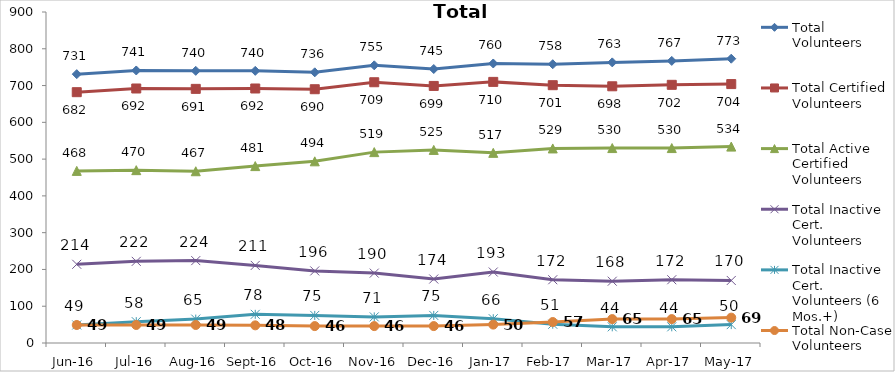
| Category | Total Volunteers | Total Certified Volunteers | Total Active Certified Volunteers | Total Inactive Cert. Volunteers | Total Inactive Cert. Volunteers (6 Mos.+) | Total Non-Case Volunteers |
|---|---|---|---|---|---|---|
| Jun-16 | 731 | 682 | 468 | 214 | 49 | 49 |
| Jul-16 | 741 | 692 | 470 | 222 | 58 | 49 |
| Aug-16 | 740 | 691 | 467 | 224 | 65 | 49 |
| Sep-16 | 740 | 692 | 481 | 211 | 78 | 48 |
| Oct-16 | 736 | 690 | 494 | 196 | 75 | 46 |
| Nov-16 | 755 | 709 | 519 | 190 | 71 | 46 |
| Dec-16 | 745 | 699 | 525 | 174 | 75 | 46 |
| Jan-17 | 760 | 710 | 517 | 193 | 66 | 50 |
| Feb-17 | 758 | 701 | 529 | 172 | 51 | 57 |
| Mar-17 | 763 | 698 | 530 | 168 | 44 | 65 |
| Apr-17 | 767 | 702 | 530 | 172 | 44 | 65 |
| May-17 | 773 | 704 | 534 | 170 | 50 | 69 |